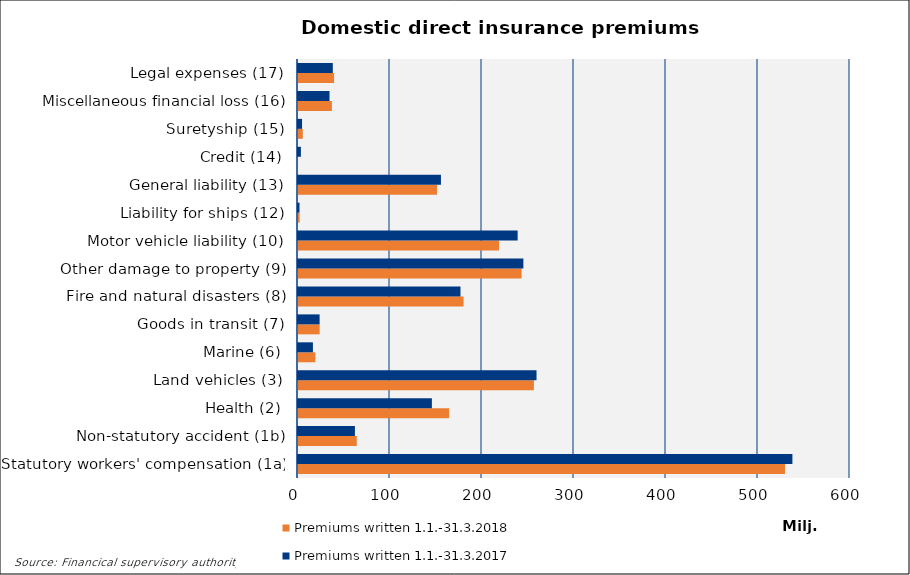
| Category | Premiums written |
|---|---|
| Statutory workers' compensation (1a) | 537398.608 |
| Non-statutory accident (1b) | 61862.08 |
| Health (2) | 145526.784 |
| Land vehicles (3) | 259271.828 |
| Marine (6) | 16217.581 |
| Goods in transit (7) | 23485.322 |
| Fire and natural disasters (8) | 176606.004 |
| Other damage to property (9) | 244979.63 |
| Motor vehicle liability (10) | 238735.31 |
| Liability for ships (12) | 1644.077 |
| General liability (13) | 155376.778 |
| Credit (14) | 3142.394 |
| Suretyship (15) | 4396.295 |
| Miscellaneous financial loss (16) | 34254.66 |
| Legal expenses (17) | 37830.226 |